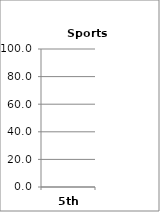
| Category | Sports (Choices) |
|---|---|
| 5th | 0 |